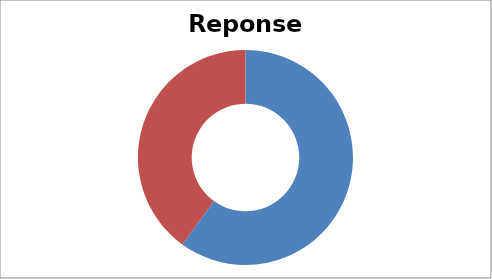
| Category | Total |
|---|---|
| Sum of Overall Response | 60 |
| Sum of Non-resp | 40 |